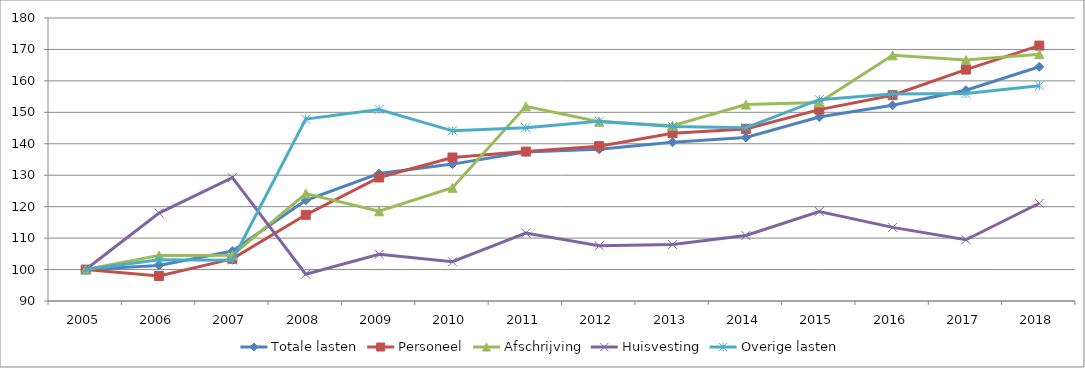
| Category | Totale lasten | Personeel | Afschrijving | Huisvesting | Overige lasten |
|---|---|---|---|---|---|
| 2005.0 | 100 | 100 | 100 | 100 | 100 |
| 2006.0 | 101.301 | 97.949 | 104.506 | 117.948 | 103.111 |
| 2007.0 | 105.876 | 103.387 | 104.584 | 129.213 | 102.991 |
| 2008.0 | 122.03 | 117.407 | 124.16 | 98.531 | 147.864 |
| 2009.0 | 130.557 | 129.274 | 118.537 | 104.856 | 150.913 |
| 2010.0 | 133.535 | 135.64 | 125.999 | 102.477 | 144.12 |
| 2011.0 | 137.387 | 137.525 | 151.917 | 111.609 | 145.079 |
| 2012.0 | 138.226 | 139.248 | 147.003 | 107.587 | 147.164 |
| 2013.0 | 140.495 | 143.356 | 145.723 | 107.943 | 145.466 |
| 2014.0 | 142 | 144.734 | 152.46 | 110.841 | 145.114 |
| 2015.0 | 148.497 | 150.859 | 153.115 | 118.473 | 154.039 |
| 2016.0 | 152.229 | 155.452 | 168.123 | 113.419 | 155.827 |
| 2017.0 | 157.039 | 163.599 | 166.664 | 109.487 | 155.956 |
| 2018.0 | 164.501 | 171.221 | 168.495 | 121.086 | 158.442 |